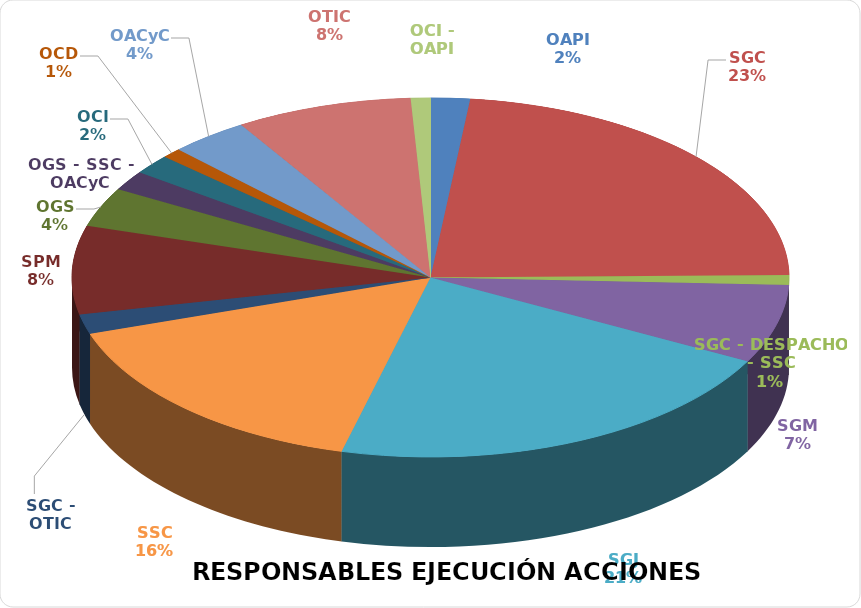
| Category | Series 0 |
|---|---|
| OAPI | 2 |
| SGC | 26 |
| SGC - DESPACHO - SSC | 1 |
| SGM | 8 |
| SGJ | 24 |
| SSC | 18 |
| SGC - OTIC | 2 |
| SPM | 9 |
| OGS | 4 |
| OGS - SSC - OACyC | 2 |
| OCI | 2 |
| OCD | 1 |
| OACyC | 4 |
| OTIC | 9 |
| OCI - OAPI | 1 |